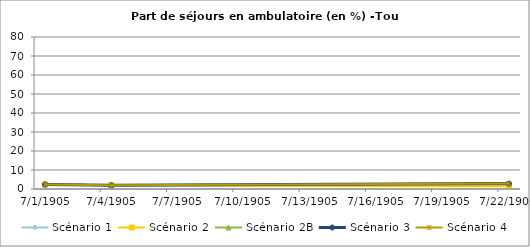
| Category | Scénario 1 | Scénario 2 | Scénario 2B | Scénario 3 | Scénario 4 |
|---|---|---|---|---|---|
| 2009.0 | 2.402 | 2.402 | 2.402 | 2.402 | 2.402 |
| 2012.0 | 1.948 | 1.948 | 1.948 | 1.948 | 1.948 |
| 2030.0 | 1.821 | 1.462 | 2.868 | 2.868 | 2.868 |